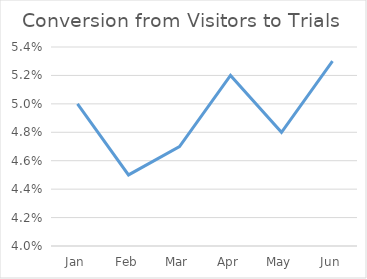
| Category | Conversion from Visitors to Trials |
|---|---|
| Jan | 0.05 |
| Feb | 0.045 |
| Mar | 0.047 |
| Apr | 0.052 |
| May | 0.048 |
| Jun | 0.053 |